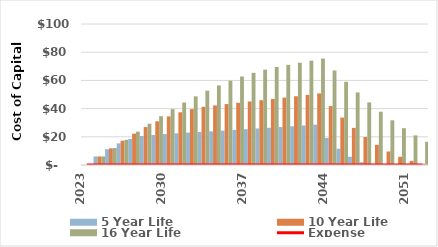
| Category | 5 Year Life | 10 Year Life | 16 Year Life |
|---|---|---|---|
| 2023.0 | 0 | 0 | 0 |
| 2024.0 | 6.065 | 6.065 | 6.065 |
| 2025.0 | 11.196 | 11.802 | 12.03 |
| 2026.0 | 15.352 | 17.199 | 17.892 |
| 2027.0 | 18.487 | 22.239 | 23.646 |
| 2028.0 | 20.556 | 26.908 | 29.289 |
| 2029.0 | 21.317 | 30.994 | 34.623 |
| 2030.0 | 21.957 | 34.488 | 39.642 |
| 2031.0 | 22.504 | 37.377 | 44.34 |
| 2032.0 | 22.991 | 39.649 | 48.71 |
| 2033.0 | 23.451 | 41.292 | 52.745 |
| 2034.0 | 23.92 | 42.292 | 56.44 |
| 2035.0 | 24.398 | 43.245 | 59.787 |
| 2036.0 | 24.886 | 44.164 | 62.778 |
| 2037.0 | 25.384 | 45.066 | 65.409 |
| 2038.0 | 25.892 | 45.967 | 67.669 |
| 2039.0 | 26.41 | 46.886 | 69.554 |
| 2040.0 | 26.938 | 47.824 | 71.054 |
| 2041.0 | 27.477 | 48.78 | 72.542 |
| 2042.0 | 28.026 | 49.756 | 74.027 |
| 2043.0 | 28.587 | 50.751 | 75.519 |
| 2044.0 | 19.182 | 41.79 | 67.053 |
| 2045.0 | 11.584 | 33.647 | 59.041 |
| 2046.0 | 5.83 | 26.338 | 51.492 |
| 2047.0 | 1.956 | 19.882 | 44.416 |
| 2048.0 | 0 | 14.293 | 37.822 |
| 2049.0 | 0 | 9.591 | 31.719 |
| 2050.0 | 0 | 5.792 | 26.119 |
| 2051.0 | 0 | 2.915 | 21.029 |
| 2052.0 | 0 | 0.978 | 16.461 |